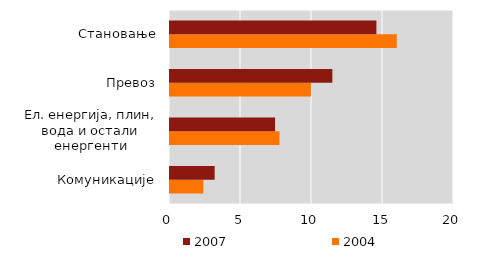
| Category | 2004 | 2007 |
|---|---|---|
| Комуникације | 2.349 | 3.144 |
| Ел. енергија, плин, вода и остали енергенти | 7.708 | 7.398 |
| Превоз | 9.926 | 11.434 |
| Становање | 15.97 | 14.536 |